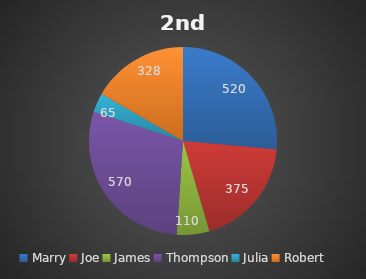
| Category | 2nd Quarter |
|---|---|
| Marry | 520 |
| Joe | 375 |
| James | 110 |
| Thompson | 570 |
| Julia | 65 |
| Robert | 328 |